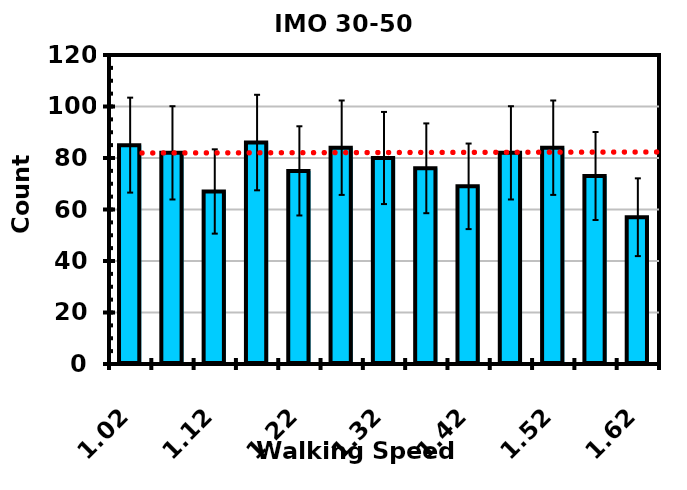
| Category | Frequency |
|---|---|
| 1.02 | 85 |
| 1.07 | 82 |
| 1.12 | 67 |
| 1.1700000000000002 | 86 |
| 1.2200000000000002 | 75 |
| 1.2700000000000002 | 84 |
| 1.3200000000000003 | 80 |
| 1.3700000000000003 | 76 |
| 1.4200000000000004 | 69 |
| 1.4700000000000004 | 82 |
| 1.5200000000000005 | 84 |
| 1.5700000000000005 | 73 |
| 1.6200000000000006 | 57 |